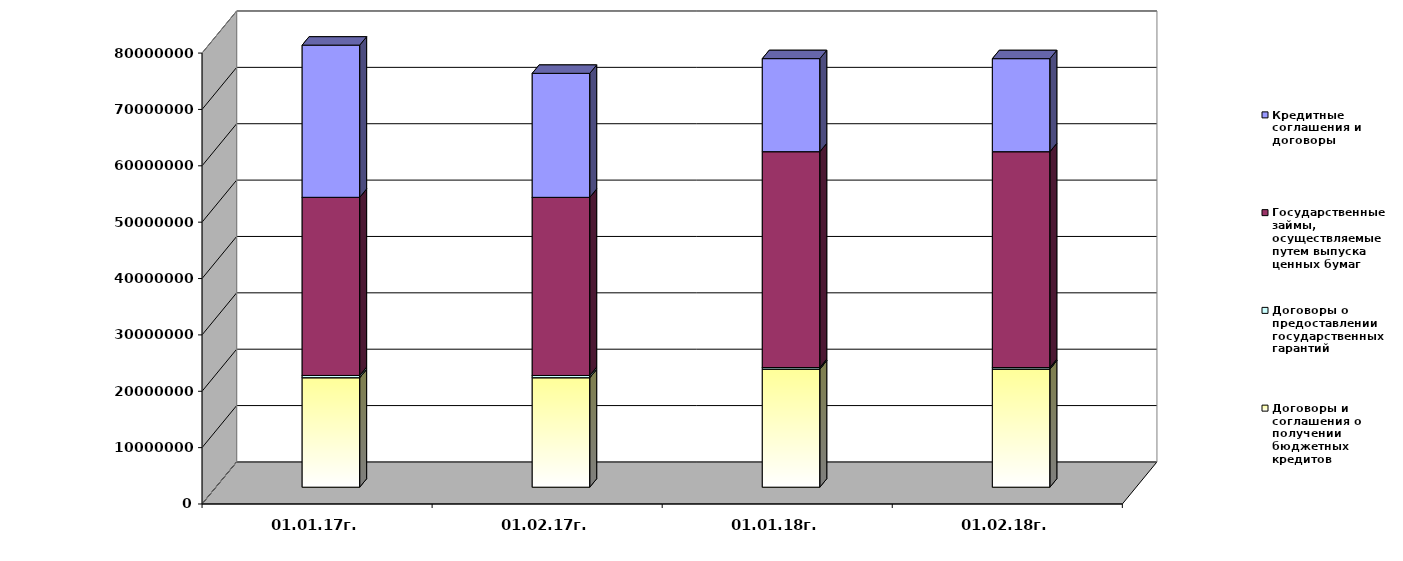
| Category | Договоры и соглашения о получении бюджетных кредитов | Договоры о предоставлении государственных гарантий | Государственные займы, осуществляемые путем выпуска ценных бумаг  | Кредитные соглашения и договоры |
|---|---|---|---|---|
| 01.01.17г. | 19424307.963 | 399998.27 | 31600010 | 27000000 |
| 01.02.17г. | 19424307.963 | 394891.39 | 31600010 | 22000000 |
| 01.01.18г. | 20959084.963 | 267412.82 | 38300000 | 16500000 |
| 01.02.18г. | 20959084.963 | 262100.52 | 38300000 | 16500000 |